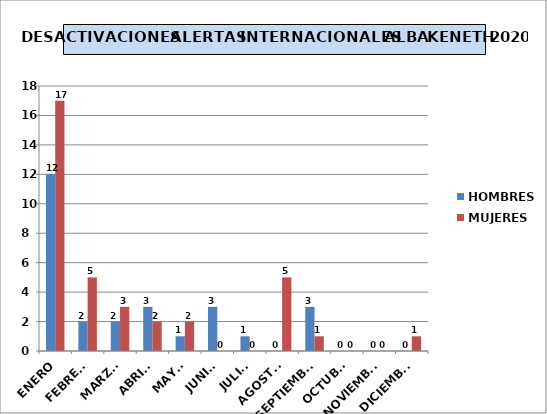
| Category | HOMBRES | MUJERES |
|---|---|---|
| ENERO | 12 | 17 |
| FEBRERO | 2 | 5 |
| MARZO | 2 | 3 |
| ABRIL  | 3 | 2 |
| MAYO | 1 | 2 |
| JUNIO | 3 | 0 |
| JULIO | 1 | 0 |
| AGOSTO | 0 | 5 |
| SEPTIEMBRE | 3 | 1 |
| OCTUBRE | 0 | 0 |
| NOVIEMBRE | 0 | 0 |
| DICIEMBRE | 0 | 1 |